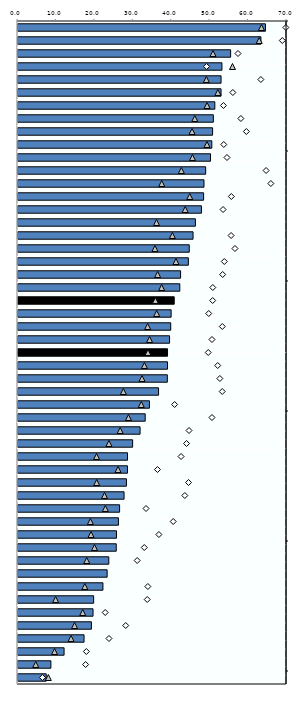
| Category | 25-64 |
|---|---|
| 0 | 64.394 |
| 1 | 63.215 |
| 2 | 55.332 |
| 3 | 53.07 |
| 4 | 52.841 |
| 5 | 52.84 |
| 6 | 51.221 |
| 7 | 50.837 |
| 8 | 50.64 |
| 9 | 50.435 |
| 10 | 50.098 |
| 11 | 48.838 |
| 12 | 48.4 |
| 13 | 48.302 |
| 14 | 47.732 |
| 15 | 46.163 |
| 16 | 45.552 |
| 17 | 44.569 |
| 18 | 44.334 |
| 19 | 42.313 |
| 20 | 42.104 |
| 21 | 40.655 |
| 22 | 39.847 |
| 23 | 39.743 |
| 24 | 39.443 |
| 25 | 38.915 |
| 26 | 38.904 |
| 27 | 38.859 |
| 28 | 36.574 |
| 29 | 34.2 |
| 30 | 33.103 |
| 31 | 31.769 |
| 32 | 29.829 |
| 33 | 28.5 |
| 34 | 28.486 |
| 35 | 28.216 |
| 36 | 27.6 |
| 37 | 26.441 |
| 38 | 26.133 |
| 39 | 25.628 |
| 40 | 25.57 |
| 41 | 23.629 |
| 42 | 23.198 |
| 43 | 22.104 |
| 44 | 19.684 |
| 45 | 19.525 |
| 46 | 19.1 |
| 47 | 17.189 |
| 48 | 11.992 |
| 49 | 8.563 |
| 50 | 7.341 |